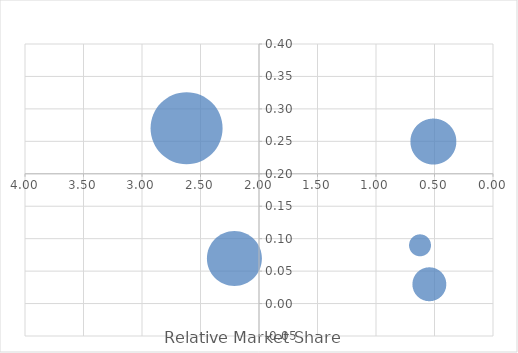
| Category | Market growth |
|---|---|
| 0.5454545454545454 | 0.03 |
| 0.5116279069767442 | 0.25 |
| 2.214285714285714 | 0.07 |
| 2.6190476190476195 | 0.27 |
| 0.625 | 0.09 |